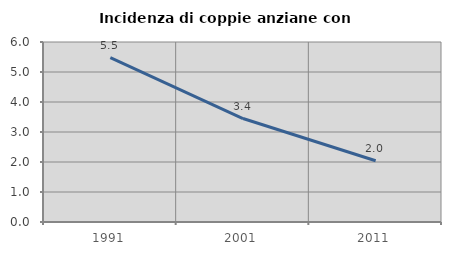
| Category | Incidenza di coppie anziane con figli |
|---|---|
| 1991.0 | 5.479 |
| 2001.0 | 3.448 |
| 2011.0 | 2.041 |